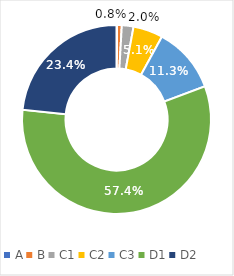
| Category | Series 0 |
|---|---|
| A | 0.001 |
| B | 0.008 |
| C1 | 0.02 |
| C2 | 0.051 |
| C3 | 0.113 |
| D1 | 0.574 |
| D2 | 0.234 |